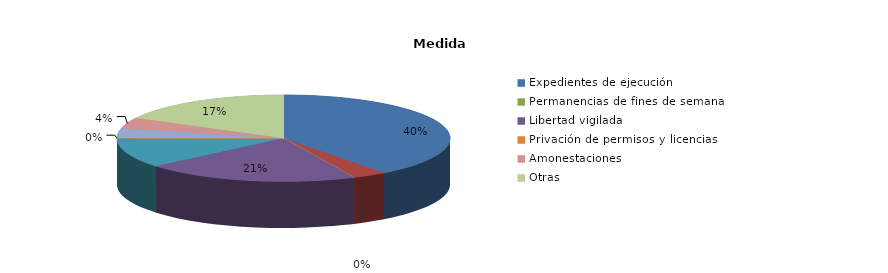
| Category | Series 0 |
|---|---|
| Expedientes de ejecución | 413 |
| Internamientos | 35 |
| Permanencias de fines de semana | 0 |
| Libertad vigilada | 216 |
| Prestaciones en beneficio de la comunidad | 116 |
| Privación de permisos y licencias | 1 |
| Convivencia Familiar Educativa | 36 |
| Amonestaciones | 43 |
| Otras | 180 |